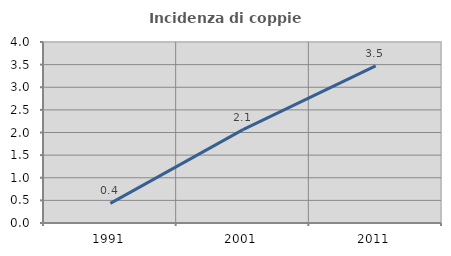
| Category | Incidenza di coppie miste |
|---|---|
| 1991.0 | 0.434 |
| 2001.0 | 2.064 |
| 2011.0 | 3.474 |